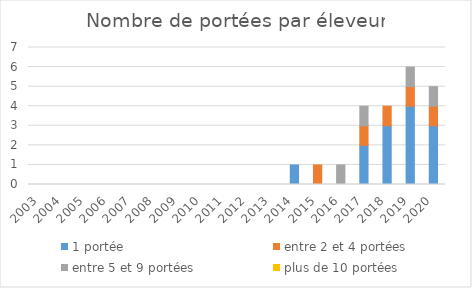
| Category | 1 portée | entre 2 et 4 portées | entre 5 et 9 portées | plus de 10 portées |
|---|---|---|---|---|
| 2003.0 | 0 | 0 | 0 | 0 |
| 2004.0 | 0 | 0 | 0 | 0 |
| 2005.0 | 0 | 0 | 0 | 0 |
| 2006.0 | 0 | 0 | 0 | 0 |
| 2007.0 | 0 | 0 | 0 | 0 |
| 2008.0 | 0 | 0 | 0 | 0 |
| 2009.0 | 0 | 0 | 0 | 0 |
| 2010.0 | 0 | 0 | 0 | 0 |
| 2011.0 | 0 | 0 | 0 | 0 |
| 2012.0 | 0 | 0 | 0 | 0 |
| 2013.0 | 0 | 0 | 0 | 0 |
| 2014.0 | 1 | 0 | 0 | 0 |
| 2015.0 | 0 | 1 | 0 | 0 |
| 2016.0 | 0 | 0 | 1 | 0 |
| 2017.0 | 2 | 1 | 1 | 0 |
| 2018.0 | 3 | 1 | 0 | 0 |
| 2019.0 | 4 | 1 | 1 | 0 |
| 2020.0 | 3 | 1 | 1 | 0 |